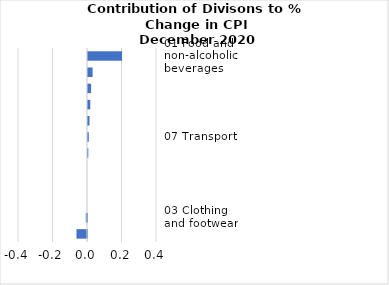
| Category |     Contributions |
|---|---|
| 01 Food and non-alcoholic beverages | 0.198 |
| 12 Miscellaneous goods and services | 0.027 |
| 04 Housing, water, electricity, gas and other fuels | 0.018 |
| 06 Health | 0.013 |
| 05 Furnishings, household equipment and routine household maintenance | 0.009 |
| 07 Transport | 0.005 |
| 09 Recreation and culture | 0.002 |
| 11 Restaurants and hotels | 0 |
| 10 Education | 0 |
| 08 Communication | 0 |
| 03 Clothing and footwear | -0.007 |
| 02 Alcoholic beverages, tobacco and narcotics | -0.061 |